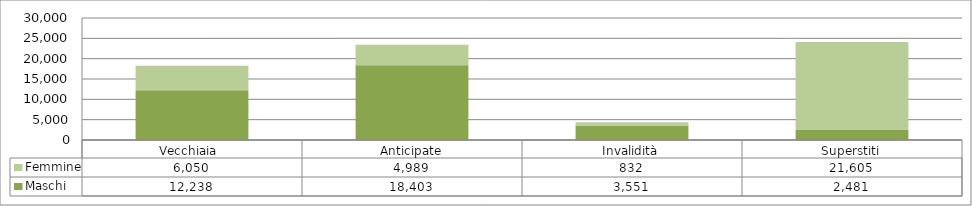
| Category | Maschi | Femmine |
|---|---|---|
| Vecchiaia  | 12238 | 6050 |
| Anticipate | 18403 | 4989 |
| Invalidità | 3551 | 832 |
| Superstiti | 2481 | 21605 |